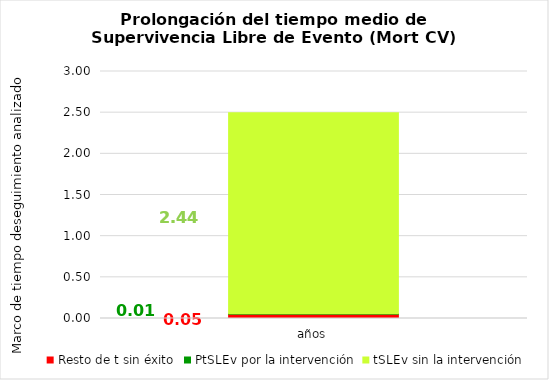
| Category | Resto de t sin éxito | PtSLEv por la intervención | tSLEv sin la intervención |
|---|---|---|---|
| años | 0.051 | 0.006 | 2.443 |